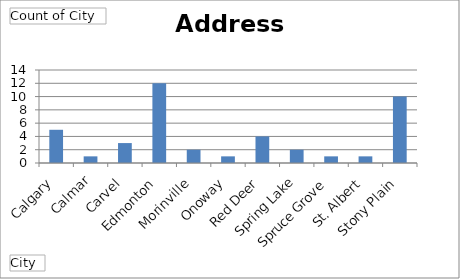
| Category | Total |
|---|---|
| Calgary | 5 |
| Calmar | 1 |
| Carvel | 3 |
| Edmonton | 12 |
| Morinville | 2 |
| Onoway | 1 |
| Red Deer | 4 |
| Spring Lake | 2 |
| Spruce Grove | 1 |
| St. Albert | 1 |
| Stony Plain | 10 |